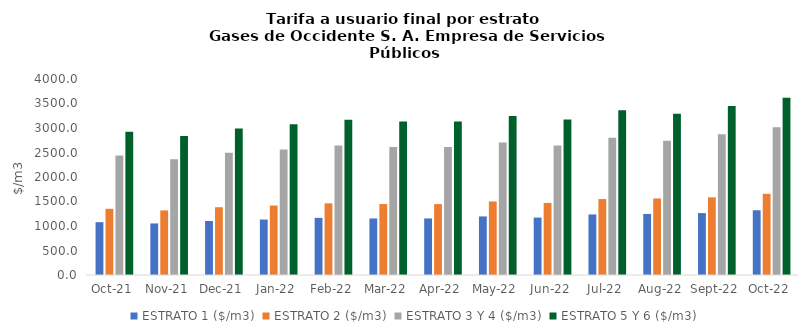
| Category | ESTRATO 1 ($/m3) | ESTRATO 2 ($/m3) | ESTRATO 3 Y 4 ($/m3) | ESTRATO 5 Y 6 ($/m3) |
|---|---|---|---|---|
| 2021-10-01 | 1077.83 | 1351.05 | 2437.13 | 2924.556 |
| 2021-11-01 | 1052.16 | 1317.95 | 2363.8 | 2836.56 |
| 2021-12-01 | 1102.54 | 1383.53 | 2493.54 | 2992.248 |
| 2022-01-01 | 1131.88 | 1417.68 | 2562.7 | 3075.24 |
| 2022-02-01 | 1166.05 | 1461.82 | 2641.32 | 3169.584 |
| 2022-03-01 | 1153.77 | 1447.9 | 2611.29 | 3133.548 |
| 2022-04-01 | 1154.04 | 1447.35 | 2611.79 | 3134.148 |
| 2022-05-01 | 1194.97 | 1500.23 | 2702.77 | 3243.324 |
| 2022-06-01 | 1172.05 | 1470.65 | 2645.4 | 3174.48 |
| 2022-07-01 | 1236.22 | 1549.57 | 2802.9 | 3363.48 |
| 2022-08-01 | 1246.24 | 1562.12 | 2740.82 | 3288.984 |
| 2022-09-01 | 1263.63 | 1585.89 | 2872.55 | 3447.06 |
| 2022-10-01 | 1321.29 | 1657.05 | 3013.74 | 3616.488 |